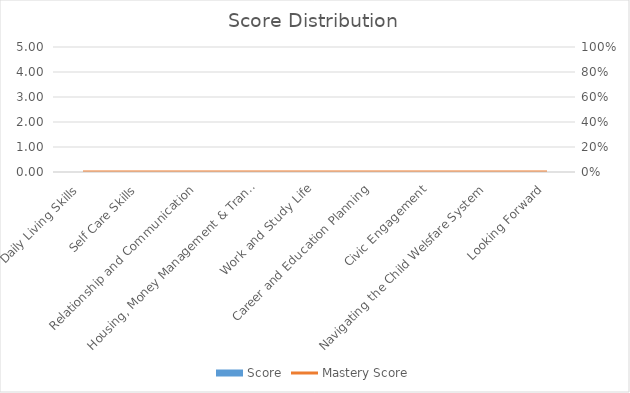
| Category | Score |
|---|---|
| Daily Living Skills | 0 |
| Self Care Skills | 0 |
| Relationship and Communication | 0 |
| Housing, Money Management & Transportation | 0 |
| Work and Study Life | 0 |
| Career and Education Planning | 0 |
| Civic Engagement | 0 |
| Navigating the Child Welsfare System | 0 |
| Looking Forward | 0 |